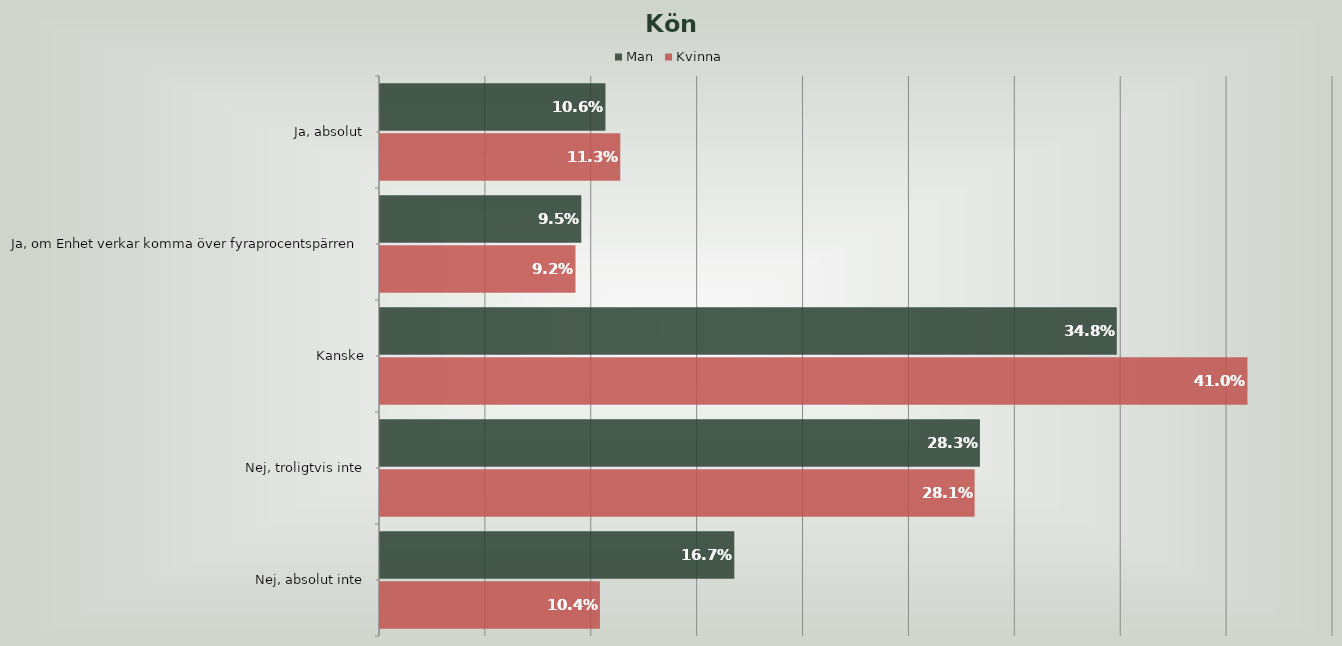
| Category | Man | Kvinna |
|---|---|---|
| Ja, absolut | 0.106 | 0.113 |
| Ja, om Enhet verkar komma över fyraprocentspärren | 0.095 | 0.092 |
| Kanske | 0.348 | 0.41 |
| Nej, troligtvis inte | 0.283 | 0.281 |
| Nej, absolut inte | 0.167 | 0.104 |